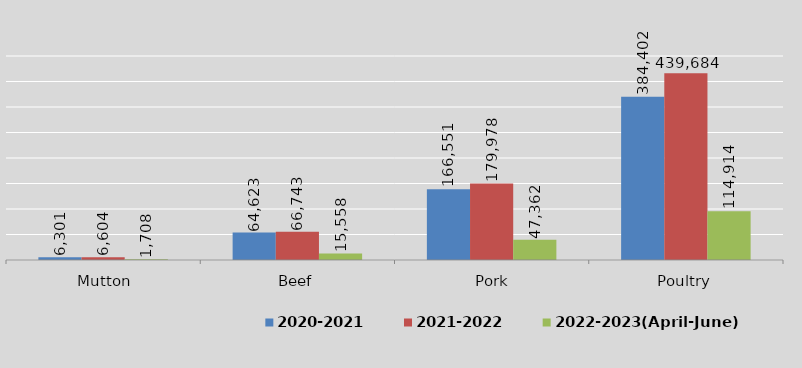
| Category | 2020-2021 | 2021-2022 | 2022-2023(April-June) |
|---|---|---|---|
|  Mutton | 6301 | 6604 | 1708 |
| Beef | 64623 | 66743 | 15558 |
|  Pork | 166551 | 179978 | 47362 |
| Poultry | 384402 | 439684 | 114914 |